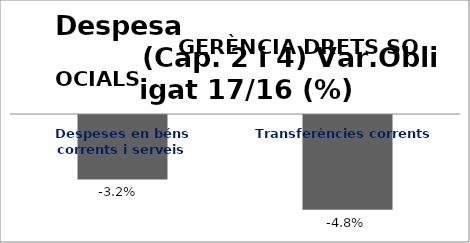
| Category | Series 0 |
|---|---|
| Despeses en béns corrents i serveis | -0.032 |
| Transferències corrents | -0.048 |